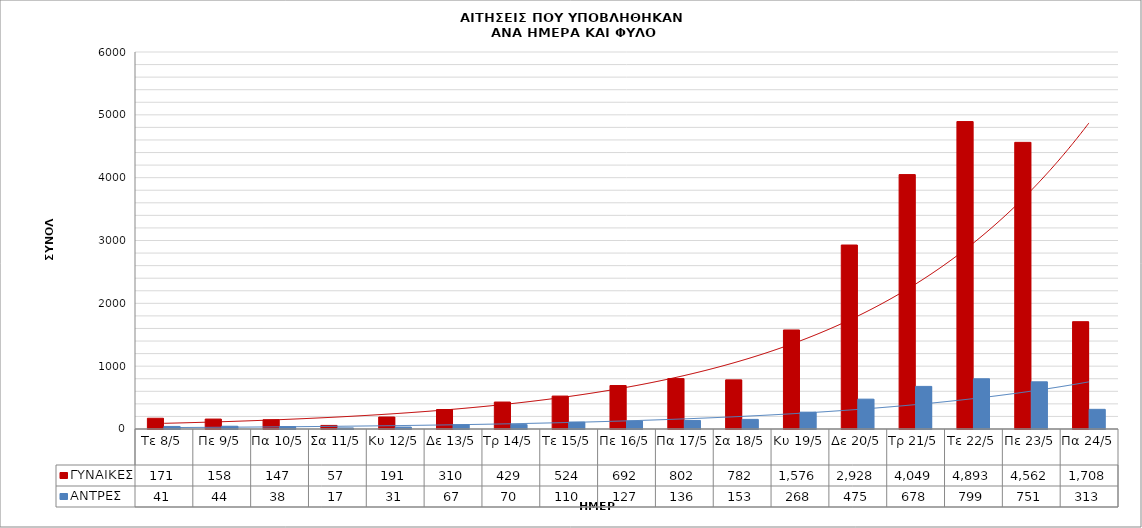
| Category | ΓΥΝΑΙΚΕΣ | ΑΝΤΡΕΣ |
|---|---|---|
| Τε 8/5 | 171 | 41 |
| Πε 9/5 | 158 | 44 |
| Πα 10/5 | 147 | 38 |
| Σα 11/5 | 57 | 17 |
| Κυ 12/5 | 191 | 31 |
| Δε 13/5 | 310 | 67 |
| Τρ 14/5 | 429 | 70 |
| Τε 15/5 | 524 | 110 |
| Πε 16/5 | 692 | 127 |
| Πα 17/5 | 802 | 136 |
| Σα 18/5 | 782 | 153 |
| Κυ 19/5 | 1576 | 268 |
| Δε 20/5 | 2928 | 475 |
| Τρ 21/5 | 4049 | 678 |
| Τε 22/5 | 4893 | 799 |
| Πε 23/5 | 4562 | 751 |
| Πα 24/5 | 1708 | 313 |